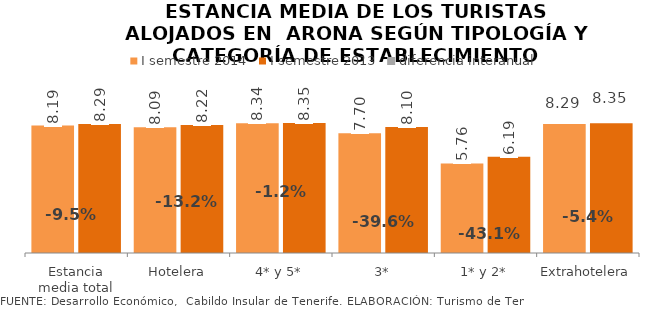
| Category | I semestre 2014 | I semestre 2013 |
|---|---|---|
| Estancia media total | 8.192 | 8.286 |
| Hotelera | 8.091 | 8.223 |
| 4* y 5* | 8.34 | 8.352 |
| 3* | 7.7 | 8.096 |
| 1* y 2* | 5.756 | 6.188 |
| Extrahotelera | 8.295 | 8.349 |